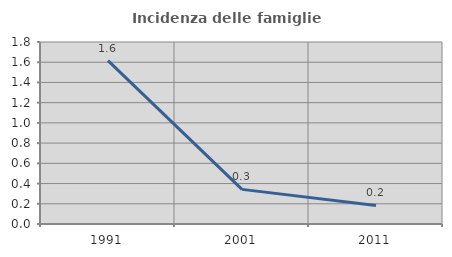
| Category | Incidenza delle famiglie numerose |
|---|---|
| 1991.0 | 1.616 |
| 2001.0 | 0.342 |
| 2011.0 | 0.183 |